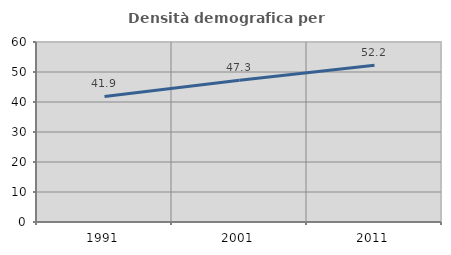
| Category | Densità demografica |
|---|---|
| 1991.0 | 41.854 |
| 2001.0 | 47.265 |
| 2011.0 | 52.247 |